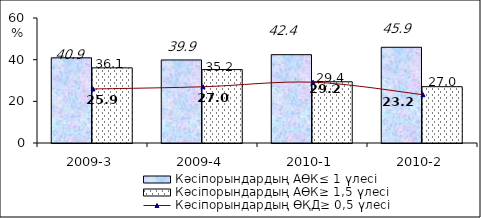
| Category | Кәсіпорындардың АӨК≤ 1 үлесі | Кәсіпорындардың АӨК≥ 1,5 үлесі |
|---|---|---|
| 2009-3 | 40.892 | 36.064 |
| 2009-4 | 39.855 | 35.243 |
| 2010-1 | 42.395 | 29.39 |
| 2010-2 | 45.95 | 27.025 |